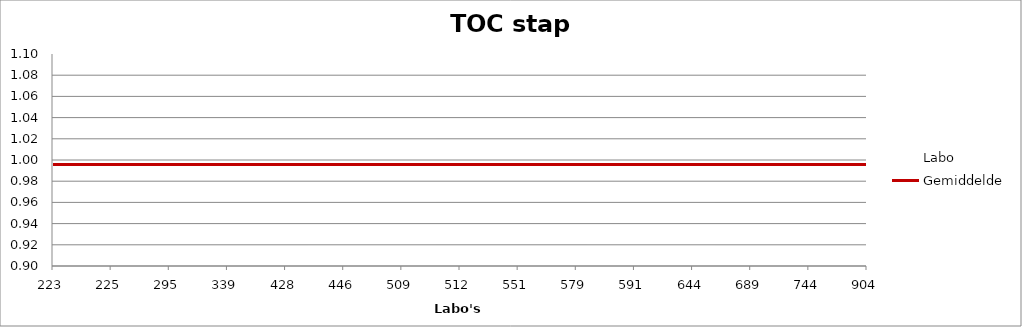
| Category | Labo | Gemiddelde |
|---|---|---|
| 223.0 | 0.958 | 0.996 |
| 225.0 | 1.034 | 0.996 |
| 295.0 | 0.984 | 0.996 |
| 339.0 | 1.001 | 0.996 |
| 428.0 | 0.995 | 0.996 |
| 446.0 | 0.97 | 0.996 |
| 509.0 | 0.977 | 0.996 |
| 512.0 | 1.025 | 0.996 |
| 551.0 | 1.03 | 0.996 |
| 579.0 | 0.961 | 0.996 |
| 591.0 | 1.023 | 0.996 |
| 644.0 | 0.999 | 0.996 |
| 689.0 | 0.966 | 0.996 |
| 744.0 | 1.03 | 0.996 |
| 904.0 | 0.986 | 0.996 |